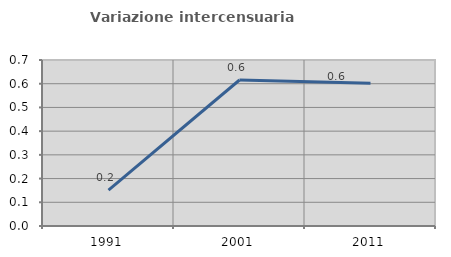
| Category | Variazione intercensuaria annua |
|---|---|
| 1991.0 | 0.151 |
| 2001.0 | 0.616 |
| 2011.0 | 0.602 |